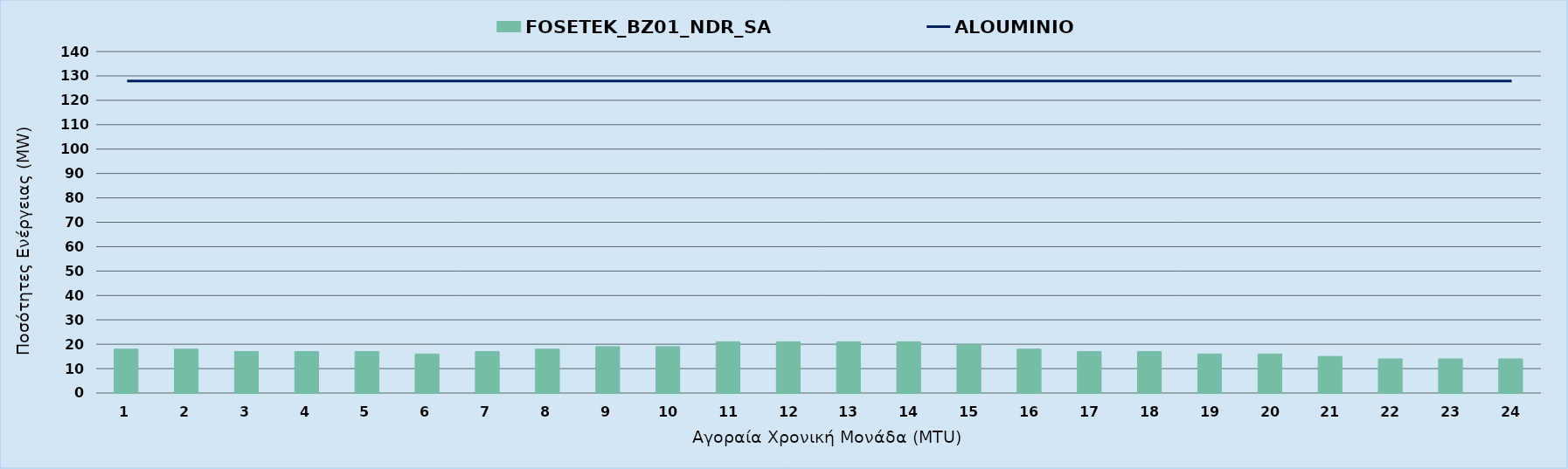
| Category | FOSETEK_BZ01_NDR_SA |
|---|---|
| 0 | 18 |
| 1 | 18 |
| 2 | 17 |
| 3 | 17 |
| 4 | 17 |
| 5 | 16 |
| 6 | 17 |
| 7 | 18 |
| 8 | 19 |
| 9 | 19 |
| 10 | 21 |
| 11 | 21 |
| 12 | 21 |
| 13 | 21 |
| 14 | 20 |
| 15 | 18 |
| 16 | 17 |
| 17 | 17 |
| 18 | 16 |
| 19 | 16 |
| 20 | 15 |
| 21 | 14 |
| 22 | 14 |
| 23 | 14 |